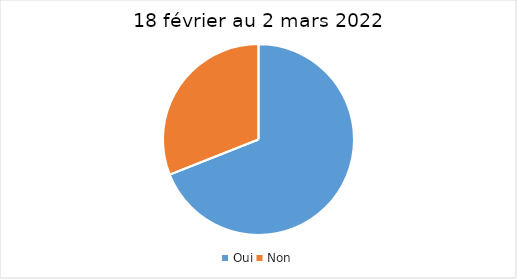
| Category | 18 février au 2 mars 2022 |
|---|---|
| Oui | 69 |
| Non | 31 |